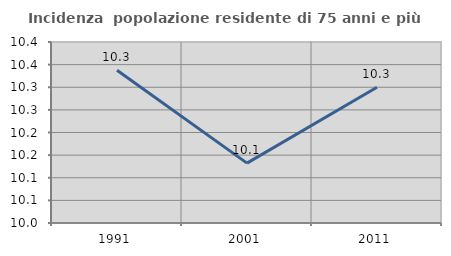
| Category | Incidenza  popolazione residente di 75 anni e più |
|---|---|
| 1991.0 | 10.337 |
| 2001.0 | 10.132 |
| 2011.0 | 10.3 |